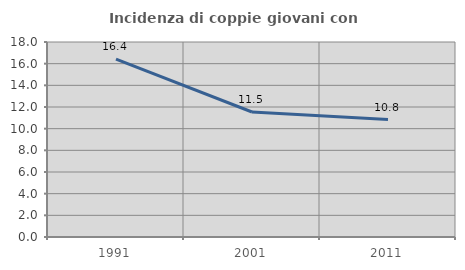
| Category | Incidenza di coppie giovani con figli |
|---|---|
| 1991.0 | 16.423 |
| 2001.0 | 11.538 |
| 2011.0 | 10.836 |